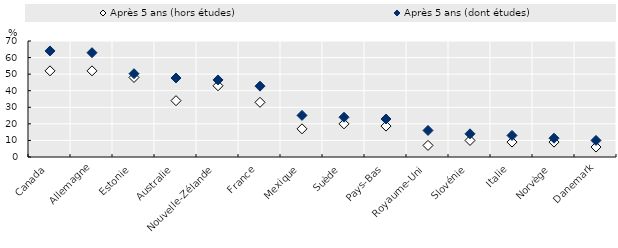
| Category | Après 5 ans (hors études) | Après 5 ans (dont études) |
|---|---|---|
| Canada | 52 | 64 |
| Allemagne | 52 | 62.929 |
| Estonie | 48 | 50.248 |
| Australie | 34 | 47.665 |
| Nouvelle-Zélande | 43 | 46.495 |
| France | 33 | 42.757 |
| Mexique | 17 | 25.095 |
| Suède | 20 | 24 |
| Pays-Bas | 18.647 | 22.937 |
| Royaume-Uni | 7 | 16 |
| Slovénie | 10 | 14 |
| Italie | 9 | 13 |
| Norvège | 9 | 11.339 |
| Danemark | 6 | 10 |